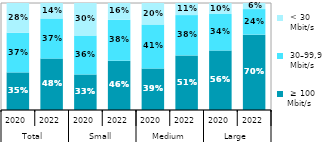
| Category |  ≥ 100 
Mbit/s  |  30–99,9 
 Mbit/s |  < 30 
 Mbit/s |
|---|---|---|---|
| 0 | 0.351 | 0.371 | 0.277 |
| 1 | 0.481 | 0.375 | 0.145 |
| 2 | 0.332 | 0.364 | 0.304 |
| 3 | 0.461 | 0.382 | 0.157 |
| 4 | 0.388 | 0.412 | 0.2 |
| 5 | 0.51 | 0.377 | 0.113 |
| 6 | 0.556 | 0.341 | 0.103 |
| 7 | 0.704 | 0.239 | 0.057 |